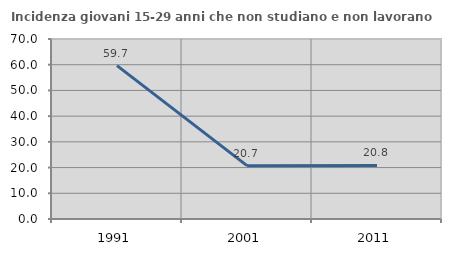
| Category | Incidenza giovani 15-29 anni che non studiano e non lavorano  |
|---|---|
| 1991.0 | 59.655 |
| 2001.0 | 20.748 |
| 2011.0 | 20.847 |